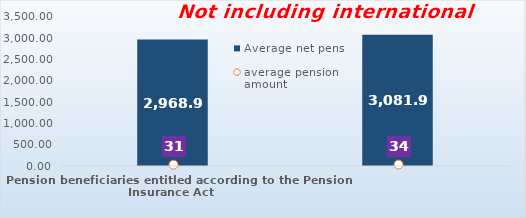
| Category | Average net pension  |
|---|---|
| Pension beneficiaries entitled according to the Pension Insurance Act   | 2968.9 |
| Pension beneficiaries entitled to pension FOR THE FIRST TIME in 2021 according to the Pension Insurance Act  - NEW BENEFICIARIES | 3081.923 |